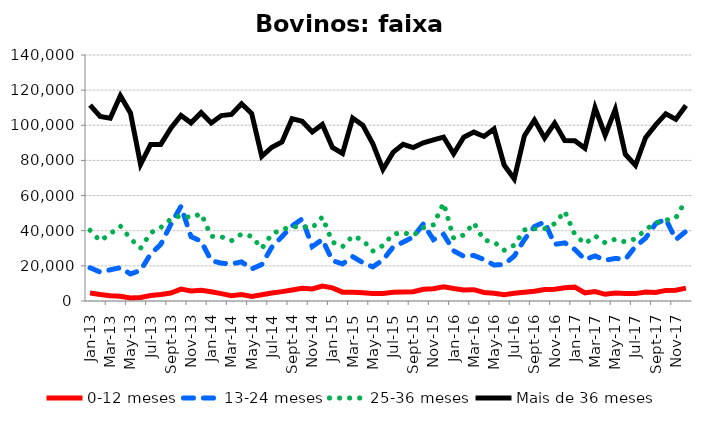
| Category | 0-12 meses | 13-24 meses | 25-36 meses | Mais de 36 meses |
|---|---|---|---|---|
| 2013-01-01 | 4523 | 18915 | 40258 | 111473 |
| 2013-02-01 | 3754 | 16449 | 34186 | 104983 |
| 2013-03-01 | 2979 | 17744 | 38203 | 103985 |
| 2013-04-01 | 2753 | 18970 | 42669 | 116857 |
| 2013-05-01 | 1762 | 15406 | 35453 | 107061 |
| 2013-06-01 | 2044 | 17379 | 30020 | 77770 |
| 2013-07-01 | 3083 | 26818 | 38797 | 89082 |
| 2013-08-01 | 3723 | 32186 | 41811 | 89109 |
| 2013-09-01 | 4570 | 43630 | 46619 | 98375 |
| 2013-10-01 | 6791 | 53856 | 48612 | 105630 |
| 2013-11-01 | 5717 | 36604 | 47450 | 101377 |
| 2013-12-01 | 6078 | 33989 | 49709 | 107198 |
| 2014-01-01 | 5248 | 22987 | 36805 | 101301 |
| 2014-02-01 | 4178 | 21521 | 36566 | 105508 |
| 2014-03-01 | 2961 | 21080 | 34287 | 106150 |
| 2014-04-01 | 3635 | 22270 | 38079 | 112256 |
| 2014-05-01 | 2639 | 18214 | 36829 | 106729 |
| 2014-06-01 | 3511 | 20776 | 29905 | 82337 |
| 2014-07-01 | 4500 | 30673 | 38162 | 87514 |
| 2014-08-01 | 5322 | 36652 | 40724 | 90467 |
| 2014-09-01 | 6288 | 42672 | 42130 | 103778 |
| 2014-10-01 | 7239 | 46747 | 42381 | 102260 |
| 2014-11-01 | 6823 | 30958 | 41619 | 96213 |
| 2014-12-01 | 8456 | 35019 | 47767 | 100465 |
| 2015-01-01 | 7480 | 22972 | 33527 | 87362 |
| 2015-02-01 | 5044 | 21115 | 30892 | 83981 |
| 2015-03-01 | 4986 | 25275 | 37005 | 104102 |
| 2015-04-01 | 4742 | 21822 | 34710 | 100064 |
| 2015-05-01 | 4326 | 19431 | 28411 | 89476 |
| 2015-06-01 | 4215 | 23364 | 31558 | 74889 |
| 2015-07-01 | 4963 | 30653 | 38043 | 84565 |
| 2015-08-01 | 5084 | 33490 | 38957 | 89186 |
| 2015-09-01 | 5285 | 36467 | 37284 | 87352 |
| 2015-10-01 | 6673 | 43831 | 41761 | 90018 |
| 2015-11-01 | 6962 | 34906 | 43343 | 91721 |
| 2015-12-01 | 8022 | 37970 | 55719 | 93309 |
| 2016-01-01 | 7077 | 28574 | 35676 | 83812 |
| 2016-02-01 | 6281 | 25438 | 37532 | 93222 |
| 2016-03-01 | 6426 | 25911 | 44447 | 96107 |
| 2016-04-01 | 4891 | 23587 | 34627 | 93650 |
| 2016-05-01 | 4447 | 20466 | 33607 | 97932 |
| 2016-06-01 | 3613 | 20825 | 28912 | 77374 |
| 2016-07-01 | 4431 | 25596 | 31751 | 69482 |
| 2016-08-01 | 5030 | 34915 | 40511 | 93923 |
| 2016-09-01 | 5505 | 42372 | 41062 | 102929 |
| 2016-10-01 | 6479 | 45022 | 41082 | 92818 |
| 2016-11-01 | 6646 | 32237 | 43995 | 101247 |
| 2016-12-01 | 7545 | 33079 | 51080 | 91368 |
| 2017-01-01 | 7893 | 29351 | 37795 | 91237 |
| 2017-02-01 | 4653 | 23574 | 32562 | 86954 |
| 2017-03-01 | 5366 | 25650 | 37041 | 109979 |
| 2017-04-01 | 3802 | 23171 | 33138 | 94404 |
| 2017-05-01 | 4508 | 24218 | 35164 | 109018 |
| 2017-06-01 | 4304 | 23793 | 33630 | 83524 |
| 2017-07-01 | 4202 | 31020 | 35407 | 77184 |
| 2017-08-01 | 5105 | 35769 | 40600 | 92916 |
| 2017-09-01 | 4834 | 44004 | 44554 | 100247 |
| 2017-10-01 | 6039 | 46612 | 46038 | 106486 |
| 2017-11-01 | 6132 | 34966 | 47346 | 103478 |
| 2017-12-01 | 7338 | 39655 | 57463 | 111211 |